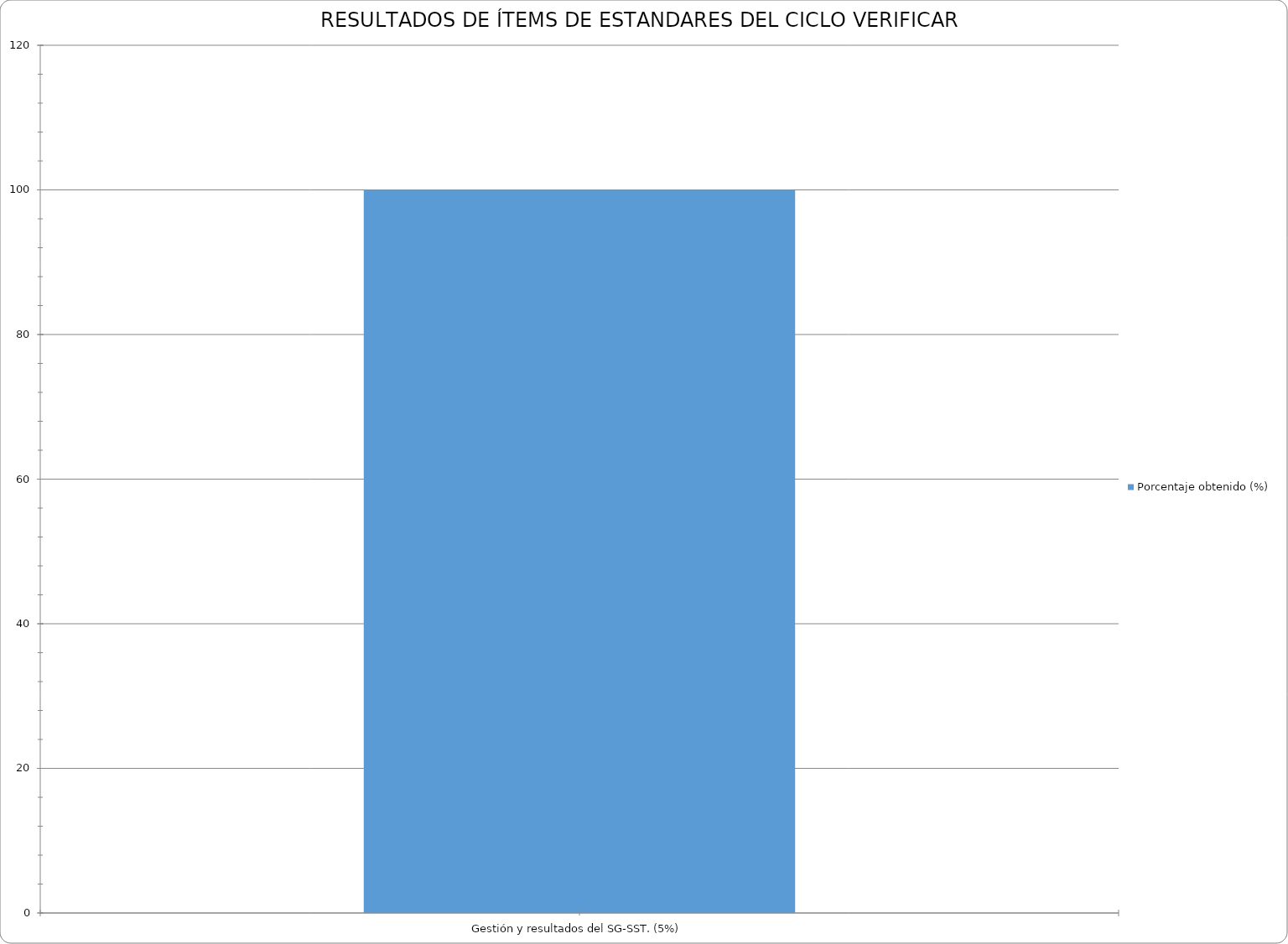
| Category | Porcentaje obtenido (%) |
|---|---|
| Gestión y resultados del SG-SST. (5%) | 100 |